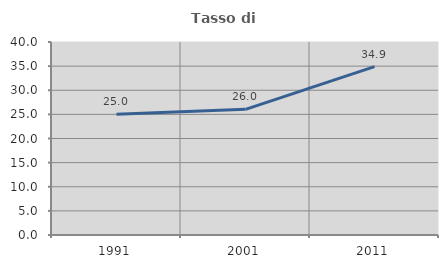
| Category | Tasso di occupazione   |
|---|---|
| 1991.0 | 25.013 |
| 2001.0 | 26.043 |
| 2011.0 | 34.895 |